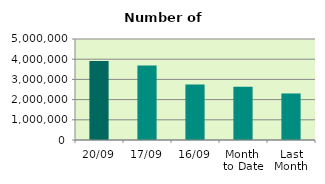
| Category | Series 0 |
|---|---|
| 20/09 | 3909042 |
| 17/09 | 3686774 |
| 16/09 | 2742328 |
| Month 
to Date | 2632835.714 |
| Last
Month | 2303894.727 |